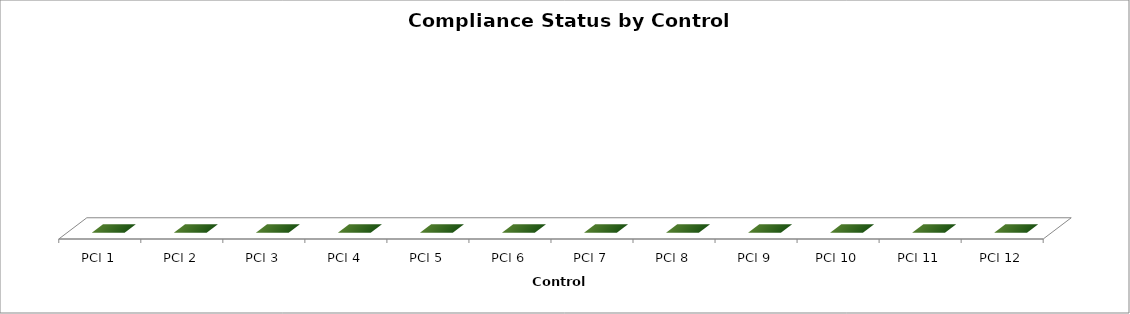
| Category | Compliance Status by Control Requirements |
|---|---|
| PCI 1 | 0 |
| PCI 2 | 0 |
| PCI 3 | 0 |
| PCI 4 | 0 |
| PCI 5 | 0 |
| PCI 6 | 0 |
| PCI 7 | 0 |
| PCI 8 | 0 |
| PCI 9 | 0 |
| PCI 10 | 0 |
| PCI 11 | 0 |
| PCI 12 | 0 |